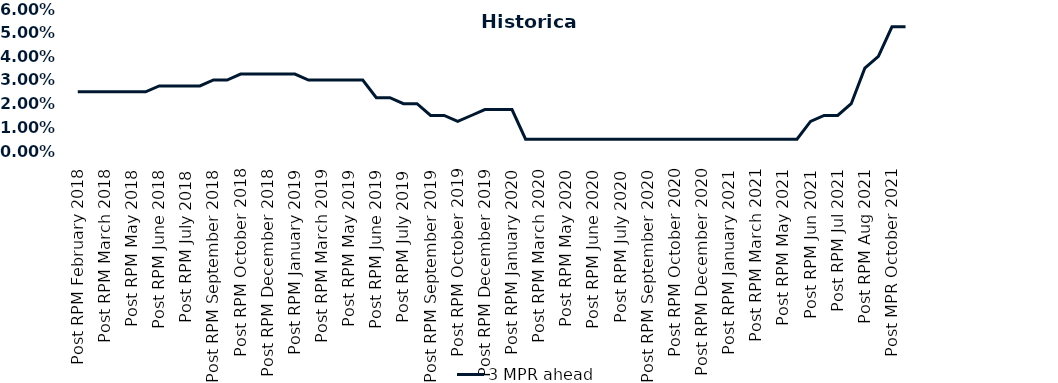
| Category | 3 MPR ahead |
|---|---|
| Post RPM February 2018 | 0.025 |
| Pre RPM March 2018 | 0.025 |
| Post RPM March 2018 | 0.025 |
| Pre RPM May 2018 | 0.025 |
| Post RPM May 2018 | 0.025 |
| Pre RPM June 2018 | 0.025 |
| Post RPM June 2018 | 0.028 |
| Pre RPM July 2018 | 0.028 |
| Post RPM July 2018 | 0.028 |
| Pre RPM September 2018 | 0.028 |
| Post RPM September 2018 | 0.03 |
| Pre RPM October 2018 | 0.03 |
| Post RPM October 2018 | 0.032 |
| Pre RPM December 2018 | 0.032 |
| Post RPM December 2018 | 0.032 |
| Pre RPM January 2019 | 0.032 |
| Post RPM January 2019 | 0.032 |
| Pre RPM March 2019 | 0.03 |
| Post RPM March 2019 | 0.03 |
| Pre RPM May 2019 | 0.03 |
| Post RPM May 2019 | 0.03 |
| Pre RPM June 2019 | 0.03 |
| Post RPM June 2019 | 0.022 |
| Pre RPM July 2019 | 0.022 |
| Post RPM July 2019 | 0.02 |
| Pre RPM September 2019 | 0.02 |
| Post RPM September 2019 | 0.015 |
| Pre RPM October 2019 | 0.015 |
| Post RPM October 2019 | 0.012 |
| Pre RPM December 2019 | 0.015 |
| Post RPM December 2019 | 0.018 |
| Pre RPM January 2020 | 0.018 |
| Post RPM January 2020 | 0.018 |
| Pre RPM March 2020 | 0.005 |
| Post RPM March 2020 | 0.005 |
| Pre RPM May 2020 | 0.005 |
| Post RPM May 2020 | 0.005 |
| Pre RPM June 2020 | 0.005 |
| Post RPM June 2020 | 0.005 |
| Pre RPM July 2020 | 0.005 |
| Post RPM July 2020 | 0.005 |
| Pre RPM September 2020 | 0.005 |
| Post RPM September 2020 | 0.005 |
| Pre RPM October 2020 | 0.005 |
| Post RPM October 2020 | 0.005 |
| Pre RPM December 2020 | 0.005 |
|  Post RPM December 2020 | 0.005 |
| Pre RPM January 2021 | 0.005 |
| Post RPM January 2021 | 0.005 |
|  Pre RPM March 2021 | 0.005 |
|  Post RPM March 2021 | 0.005 |
|  Pre RPM May 2021 | 0.005 |
|  Post RPM May 2021 | 0.005 |
|  Pre RPM Jun 2021 | 0.005 |
|   Post RPM Jun 2021 | 0.012 |
| Pre RPM Jul 2021 | 0.015 |
|  Post RPM Jul 2021 | 0.015 |
| Pre RPM Aug 2021 | 0.02 |
|  Post RPM Aug 2021 | 0.035 |
| Pre MPR October 2021 | 0.04 |
| Post MPR October 2021 | 0.052 |
| Pre MPR December 2021 | 0.052 |